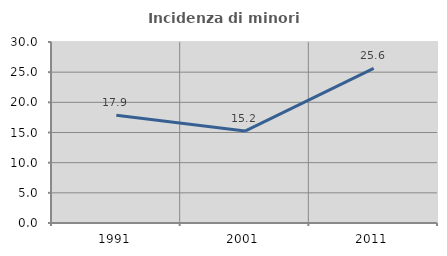
| Category | Incidenza di minori stranieri |
|---|---|
| 1991.0 | 17.857 |
| 2001.0 | 15.238 |
| 2011.0 | 25.641 |